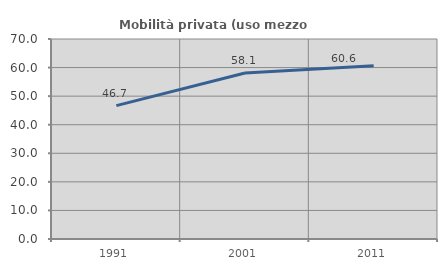
| Category | Mobilità privata (uso mezzo privato) |
|---|---|
| 1991.0 | 46.669 |
| 2001.0 | 58.074 |
| 2011.0 | 60.63 |